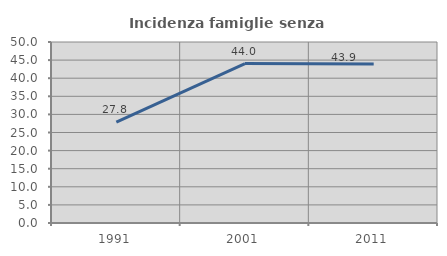
| Category | Incidenza famiglie senza nuclei |
|---|---|
| 1991.0 | 27.848 |
| 2001.0 | 44.048 |
| 2011.0 | 43.902 |